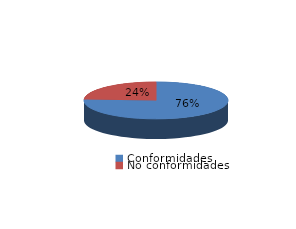
| Category | Series 0 |
|---|---|
| Conformidades | 2303 |
| No conformidades | 736 |